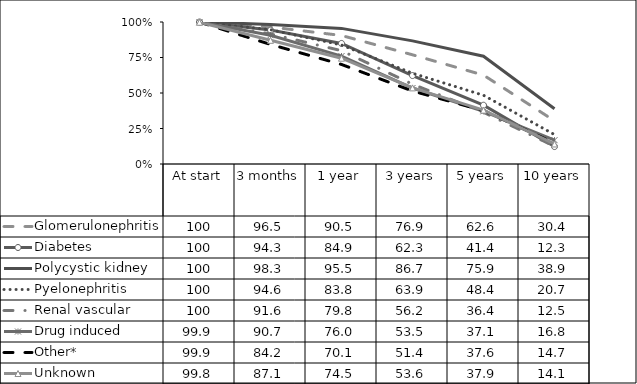
| Category | Glomerulonephritis | Diabetes | Polycystic kidney | Pyelonephritis | Renal vascular | Drug induced | Other* | Unknown |
|---|---|---|---|---|---|---|---|---|
| At start | 100 | 100 | 100 | 100 | 100 | 99.9 | 99.9 | 99.8 |
| 3 months | 96.5 | 94.3 | 98.3 | 94.6 | 91.6 | 90.7 | 84.2 | 87.1 |
| 1 year | 90.5 | 84.9 | 95.5 | 83.8 | 79.8 | 76 | 70.1 | 74.5 |
| 3 years | 76.9 | 62.3 | 86.7 | 63.9 | 56.2 | 53.5 | 51.4 | 53.6 |
| 5 years | 62.6 | 41.4 | 75.9 | 48.4 | 36.4 | 37.1 | 37.6 | 37.9 |
| 10 years | 30.4 | 12.3 | 38.9 | 20.7 | 12.5 | 16.8 | 14.7 | 14.1 |